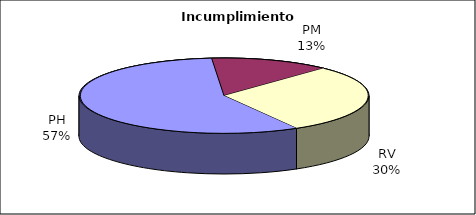
| Category | Valores |
|---|---|
| PH | 327 |
| PM | 77 |
| RV | 170 |